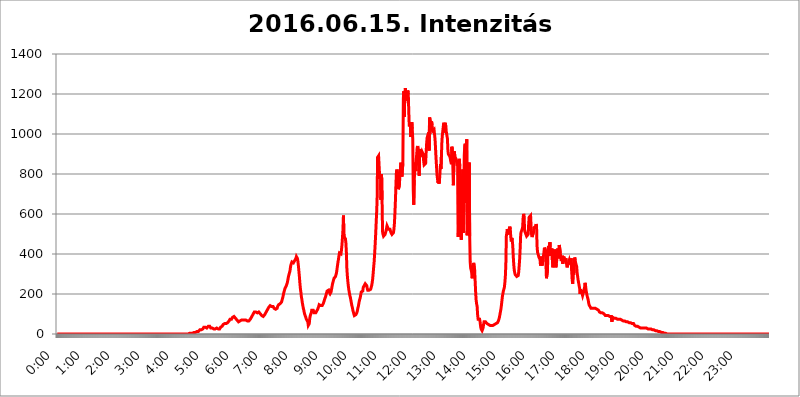
| Category | 2016.06.15. Intenzitás [W/m^2] |
|---|---|
| 0.0 | 0 |
| 0.0006944444444444445 | 0 |
| 0.001388888888888889 | 0 |
| 0.0020833333333333333 | 0 |
| 0.002777777777777778 | 0 |
| 0.003472222222222222 | 0 |
| 0.004166666666666667 | 0 |
| 0.004861111111111111 | 0 |
| 0.005555555555555556 | 0 |
| 0.0062499999999999995 | 0 |
| 0.006944444444444444 | 0 |
| 0.007638888888888889 | 0 |
| 0.008333333333333333 | 0 |
| 0.009027777777777779 | 0 |
| 0.009722222222222222 | 0 |
| 0.010416666666666666 | 0 |
| 0.011111111111111112 | 0 |
| 0.011805555555555555 | 0 |
| 0.012499999999999999 | 0 |
| 0.013194444444444444 | 0 |
| 0.013888888888888888 | 0 |
| 0.014583333333333332 | 0 |
| 0.015277777777777777 | 0 |
| 0.015972222222222224 | 0 |
| 0.016666666666666666 | 0 |
| 0.017361111111111112 | 0 |
| 0.018055555555555557 | 0 |
| 0.01875 | 0 |
| 0.019444444444444445 | 0 |
| 0.02013888888888889 | 0 |
| 0.020833333333333332 | 0 |
| 0.02152777777777778 | 0 |
| 0.022222222222222223 | 0 |
| 0.02291666666666667 | 0 |
| 0.02361111111111111 | 0 |
| 0.024305555555555556 | 0 |
| 0.024999999999999998 | 0 |
| 0.025694444444444447 | 0 |
| 0.02638888888888889 | 0 |
| 0.027083333333333334 | 0 |
| 0.027777777777777776 | 0 |
| 0.02847222222222222 | 0 |
| 0.029166666666666664 | 0 |
| 0.029861111111111113 | 0 |
| 0.030555555555555555 | 0 |
| 0.03125 | 0 |
| 0.03194444444444445 | 0 |
| 0.03263888888888889 | 0 |
| 0.03333333333333333 | 0 |
| 0.034027777777777775 | 0 |
| 0.034722222222222224 | 0 |
| 0.035416666666666666 | 0 |
| 0.036111111111111115 | 0 |
| 0.03680555555555556 | 0 |
| 0.0375 | 0 |
| 0.03819444444444444 | 0 |
| 0.03888888888888889 | 0 |
| 0.03958333333333333 | 0 |
| 0.04027777777777778 | 0 |
| 0.04097222222222222 | 0 |
| 0.041666666666666664 | 0 |
| 0.042361111111111106 | 0 |
| 0.04305555555555556 | 0 |
| 0.043750000000000004 | 0 |
| 0.044444444444444446 | 0 |
| 0.04513888888888889 | 0 |
| 0.04583333333333334 | 0 |
| 0.04652777777777778 | 0 |
| 0.04722222222222222 | 0 |
| 0.04791666666666666 | 0 |
| 0.04861111111111111 | 0 |
| 0.049305555555555554 | 0 |
| 0.049999999999999996 | 0 |
| 0.05069444444444445 | 0 |
| 0.051388888888888894 | 0 |
| 0.052083333333333336 | 0 |
| 0.05277777777777778 | 0 |
| 0.05347222222222222 | 0 |
| 0.05416666666666667 | 0 |
| 0.05486111111111111 | 0 |
| 0.05555555555555555 | 0 |
| 0.05625 | 0 |
| 0.05694444444444444 | 0 |
| 0.057638888888888885 | 0 |
| 0.05833333333333333 | 0 |
| 0.05902777777777778 | 0 |
| 0.059722222222222225 | 0 |
| 0.06041666666666667 | 0 |
| 0.061111111111111116 | 0 |
| 0.06180555555555556 | 0 |
| 0.0625 | 0 |
| 0.06319444444444444 | 0 |
| 0.06388888888888888 | 0 |
| 0.06458333333333334 | 0 |
| 0.06527777777777778 | 0 |
| 0.06597222222222222 | 0 |
| 0.06666666666666667 | 0 |
| 0.06736111111111111 | 0 |
| 0.06805555555555555 | 0 |
| 0.06874999999999999 | 0 |
| 0.06944444444444443 | 0 |
| 0.07013888888888889 | 0 |
| 0.07083333333333333 | 0 |
| 0.07152777777777779 | 0 |
| 0.07222222222222223 | 0 |
| 0.07291666666666667 | 0 |
| 0.07361111111111111 | 0 |
| 0.07430555555555556 | 0 |
| 0.075 | 0 |
| 0.07569444444444444 | 0 |
| 0.0763888888888889 | 0 |
| 0.07708333333333334 | 0 |
| 0.07777777777777778 | 0 |
| 0.07847222222222222 | 0 |
| 0.07916666666666666 | 0 |
| 0.0798611111111111 | 0 |
| 0.08055555555555556 | 0 |
| 0.08125 | 0 |
| 0.08194444444444444 | 0 |
| 0.08263888888888889 | 0 |
| 0.08333333333333333 | 0 |
| 0.08402777777777777 | 0 |
| 0.08472222222222221 | 0 |
| 0.08541666666666665 | 0 |
| 0.08611111111111112 | 0 |
| 0.08680555555555557 | 0 |
| 0.08750000000000001 | 0 |
| 0.08819444444444445 | 0 |
| 0.08888888888888889 | 0 |
| 0.08958333333333333 | 0 |
| 0.09027777777777778 | 0 |
| 0.09097222222222222 | 0 |
| 0.09166666666666667 | 0 |
| 0.09236111111111112 | 0 |
| 0.09305555555555556 | 0 |
| 0.09375 | 0 |
| 0.09444444444444444 | 0 |
| 0.09513888888888888 | 0 |
| 0.09583333333333333 | 0 |
| 0.09652777777777777 | 0 |
| 0.09722222222222222 | 0 |
| 0.09791666666666667 | 0 |
| 0.09861111111111111 | 0 |
| 0.09930555555555555 | 0 |
| 0.09999999999999999 | 0 |
| 0.10069444444444443 | 0 |
| 0.1013888888888889 | 0 |
| 0.10208333333333335 | 0 |
| 0.10277777777777779 | 0 |
| 0.10347222222222223 | 0 |
| 0.10416666666666667 | 0 |
| 0.10486111111111111 | 0 |
| 0.10555555555555556 | 0 |
| 0.10625 | 0 |
| 0.10694444444444444 | 0 |
| 0.1076388888888889 | 0 |
| 0.10833333333333334 | 0 |
| 0.10902777777777778 | 0 |
| 0.10972222222222222 | 0 |
| 0.1111111111111111 | 0 |
| 0.11180555555555556 | 0 |
| 0.11180555555555556 | 0 |
| 0.1125 | 0 |
| 0.11319444444444444 | 0 |
| 0.11388888888888889 | 0 |
| 0.11458333333333333 | 0 |
| 0.11527777777777777 | 0 |
| 0.11597222222222221 | 0 |
| 0.11666666666666665 | 0 |
| 0.1173611111111111 | 0 |
| 0.11805555555555557 | 0 |
| 0.11944444444444445 | 0 |
| 0.12013888888888889 | 0 |
| 0.12083333333333333 | 0 |
| 0.12152777777777778 | 0 |
| 0.12222222222222223 | 0 |
| 0.12291666666666667 | 0 |
| 0.12291666666666667 | 0 |
| 0.12361111111111112 | 0 |
| 0.12430555555555556 | 0 |
| 0.125 | 0 |
| 0.12569444444444444 | 0 |
| 0.12638888888888888 | 0 |
| 0.12708333333333333 | 0 |
| 0.16875 | 0 |
| 0.12847222222222224 | 0 |
| 0.12916666666666668 | 0 |
| 0.12986111111111112 | 0 |
| 0.13055555555555556 | 0 |
| 0.13125 | 0 |
| 0.13194444444444445 | 0 |
| 0.1326388888888889 | 0 |
| 0.13333333333333333 | 0 |
| 0.13402777777777777 | 0 |
| 0.13402777777777777 | 0 |
| 0.13472222222222222 | 0 |
| 0.13541666666666666 | 0 |
| 0.1361111111111111 | 0 |
| 0.13749999999999998 | 0 |
| 0.13819444444444443 | 0 |
| 0.1388888888888889 | 0 |
| 0.13958333333333334 | 0 |
| 0.14027777777777778 | 0 |
| 0.14097222222222222 | 0 |
| 0.14166666666666666 | 0 |
| 0.1423611111111111 | 0 |
| 0.14305555555555557 | 0 |
| 0.14375000000000002 | 0 |
| 0.14444444444444446 | 0 |
| 0.1451388888888889 | 0 |
| 0.1451388888888889 | 0 |
| 0.14652777777777778 | 0 |
| 0.14722222222222223 | 0 |
| 0.14791666666666667 | 0 |
| 0.1486111111111111 | 0 |
| 0.14930555555555555 | 0 |
| 0.15 | 0 |
| 0.15069444444444444 | 0 |
| 0.15138888888888888 | 0 |
| 0.15208333333333332 | 0 |
| 0.15277777777777776 | 0 |
| 0.15347222222222223 | 0 |
| 0.15416666666666667 | 0 |
| 0.15486111111111112 | 0 |
| 0.15555555555555556 | 0 |
| 0.15625 | 0 |
| 0.15694444444444444 | 0 |
| 0.15763888888888888 | 0 |
| 0.15833333333333333 | 0 |
| 0.15902777777777777 | 0 |
| 0.15972222222222224 | 0 |
| 0.16041666666666668 | 0 |
| 0.16111111111111112 | 0 |
| 0.16180555555555556 | 0 |
| 0.1625 | 0 |
| 0.16319444444444445 | 0 |
| 0.1638888888888889 | 0 |
| 0.16458333333333333 | 0 |
| 0.16527777777777777 | 0 |
| 0.16597222222222222 | 0 |
| 0.16666666666666666 | 0 |
| 0.1673611111111111 | 0 |
| 0.16805555555555554 | 0 |
| 0.16874999999999998 | 0 |
| 0.16944444444444443 | 0 |
| 0.17013888888888887 | 0 |
| 0.1708333333333333 | 0 |
| 0.17152777777777775 | 0 |
| 0.17222222222222225 | 0 |
| 0.1729166666666667 | 0 |
| 0.17361111111111113 | 0 |
| 0.17430555555555557 | 0 |
| 0.17500000000000002 | 0 |
| 0.17569444444444446 | 0 |
| 0.1763888888888889 | 0 |
| 0.17708333333333334 | 0 |
| 0.17777777777777778 | 0 |
| 0.17847222222222223 | 0 |
| 0.17916666666666667 | 0 |
| 0.1798611111111111 | 0 |
| 0.18055555555555555 | 0 |
| 0.18125 | 0 |
| 0.18194444444444444 | 0 |
| 0.1826388888888889 | 0 |
| 0.18333333333333335 | 0 |
| 0.1840277777777778 | 0 |
| 0.18472222222222223 | 3.525 |
| 0.18541666666666667 | 3.525 |
| 0.18611111111111112 | 3.525 |
| 0.18680555555555556 | 3.525 |
| 0.1875 | 3.525 |
| 0.18819444444444444 | 3.525 |
| 0.18888888888888888 | 3.525 |
| 0.18958333333333333 | 3.525 |
| 0.19027777777777777 | 3.525 |
| 0.1909722222222222 | 7.887 |
| 0.19166666666666665 | 7.887 |
| 0.19236111111111112 | 7.887 |
| 0.19305555555555554 | 7.887 |
| 0.19375 | 7.887 |
| 0.19444444444444445 | 7.887 |
| 0.1951388888888889 | 12.257 |
| 0.19583333333333333 | 12.257 |
| 0.19652777777777777 | 12.257 |
| 0.19722222222222222 | 12.257 |
| 0.19791666666666666 | 12.257 |
| 0.1986111111111111 | 16.636 |
| 0.19930555555555554 | 16.636 |
| 0.19999999999999998 | 21.024 |
| 0.20069444444444443 | 21.024 |
| 0.20138888888888887 | 21.024 |
| 0.2020833333333333 | 21.024 |
| 0.2027777777777778 | 21.024 |
| 0.2034722222222222 | 25.419 |
| 0.2041666666666667 | 25.419 |
| 0.20486111111111113 | 29.823 |
| 0.20555555555555557 | 34.234 |
| 0.20625000000000002 | 38.653 |
| 0.20694444444444446 | 34.234 |
| 0.2076388888888889 | 34.234 |
| 0.20833333333333334 | 29.823 |
| 0.20902777777777778 | 29.823 |
| 0.20972222222222223 | 29.823 |
| 0.21041666666666667 | 29.823 |
| 0.2111111111111111 | 29.823 |
| 0.21180555555555555 | 38.653 |
| 0.2125 | 38.653 |
| 0.21319444444444444 | 38.653 |
| 0.2138888888888889 | 38.653 |
| 0.21458333333333335 | 38.653 |
| 0.2152777777777778 | 29.823 |
| 0.21597222222222223 | 29.823 |
| 0.21666666666666667 | 29.823 |
| 0.21736111111111112 | 29.823 |
| 0.21805555555555556 | 25.419 |
| 0.21875 | 25.419 |
| 0.21944444444444444 | 25.419 |
| 0.22013888888888888 | 25.419 |
| 0.22083333333333333 | 25.419 |
| 0.22152777777777777 | 25.419 |
| 0.2222222222222222 | 25.419 |
| 0.22291666666666665 | 29.823 |
| 0.2236111111111111 | 29.823 |
| 0.22430555555555556 | 29.823 |
| 0.225 | 25.419 |
| 0.22569444444444445 | 25.419 |
| 0.2263888888888889 | 25.419 |
| 0.22708333333333333 | 25.419 |
| 0.22777777777777777 | 25.419 |
| 0.22847222222222222 | 29.823 |
| 0.22916666666666666 | 34.234 |
| 0.2298611111111111 | 34.234 |
| 0.23055555555555554 | 38.653 |
| 0.23124999999999998 | 38.653 |
| 0.23194444444444443 | 43.079 |
| 0.23263888888888887 | 47.511 |
| 0.2333333333333333 | 47.511 |
| 0.2340277777777778 | 51.951 |
| 0.2347222222222222 | 51.951 |
| 0.2354166666666667 | 51.951 |
| 0.23611111111111113 | 51.951 |
| 0.23680555555555557 | 51.951 |
| 0.23750000000000002 | 56.398 |
| 0.23819444444444446 | 56.398 |
| 0.2388888888888889 | 56.398 |
| 0.23958333333333334 | 60.85 |
| 0.24027777777777778 | 60.85 |
| 0.24097222222222223 | 65.31 |
| 0.24166666666666667 | 69.775 |
| 0.2423611111111111 | 74.246 |
| 0.24305555555555555 | 74.246 |
| 0.24375 | 74.246 |
| 0.24444444444444446 | 74.246 |
| 0.24513888888888888 | 78.722 |
| 0.24583333333333335 | 83.205 |
| 0.2465277777777778 | 87.692 |
| 0.24722222222222223 | 87.692 |
| 0.24791666666666667 | 87.692 |
| 0.24861111111111112 | 87.692 |
| 0.24930555555555556 | 83.205 |
| 0.25 | 78.722 |
| 0.25069444444444444 | 74.246 |
| 0.2513888888888889 | 74.246 |
| 0.2520833333333333 | 69.775 |
| 0.25277777777777777 | 65.31 |
| 0.2534722222222222 | 65.31 |
| 0.25416666666666665 | 60.85 |
| 0.2548611111111111 | 60.85 |
| 0.2555555555555556 | 65.31 |
| 0.25625000000000003 | 65.31 |
| 0.2569444444444445 | 65.31 |
| 0.2576388888888889 | 69.775 |
| 0.25833333333333336 | 69.775 |
| 0.2590277777777778 | 74.246 |
| 0.25972222222222224 | 69.775 |
| 0.2604166666666667 | 69.775 |
| 0.2611111111111111 | 69.775 |
| 0.26180555555555557 | 69.775 |
| 0.2625 | 69.775 |
| 0.26319444444444445 | 69.775 |
| 0.2638888888888889 | 69.775 |
| 0.26458333333333334 | 69.775 |
| 0.2652777777777778 | 69.775 |
| 0.2659722222222222 | 65.31 |
| 0.26666666666666666 | 65.31 |
| 0.2673611111111111 | 60.85 |
| 0.26805555555555555 | 60.85 |
| 0.26875 | 65.31 |
| 0.26944444444444443 | 65.31 |
| 0.2701388888888889 | 69.775 |
| 0.2708333333333333 | 74.246 |
| 0.27152777777777776 | 78.722 |
| 0.2722222222222222 | 83.205 |
| 0.27291666666666664 | 83.205 |
| 0.2736111111111111 | 92.184 |
| 0.2743055555555555 | 96.682 |
| 0.27499999999999997 | 101.184 |
| 0.27569444444444446 | 105.69 |
| 0.27638888888888885 | 110.201 |
| 0.27708333333333335 | 114.716 |
| 0.2777777777777778 | 114.716 |
| 0.27847222222222223 | 110.201 |
| 0.2791666666666667 | 110.201 |
| 0.2798611111111111 | 105.69 |
| 0.28055555555555556 | 105.69 |
| 0.28125 | 105.69 |
| 0.28194444444444444 | 105.69 |
| 0.2826388888888889 | 110.201 |
| 0.2833333333333333 | 110.201 |
| 0.28402777777777777 | 105.69 |
| 0.2847222222222222 | 101.184 |
| 0.28541666666666665 | 101.184 |
| 0.28611111111111115 | 96.682 |
| 0.28680555555555554 | 92.184 |
| 0.28750000000000003 | 87.692 |
| 0.2881944444444445 | 87.692 |
| 0.2888888888888889 | 87.692 |
| 0.28958333333333336 | 92.184 |
| 0.2902777777777778 | 92.184 |
| 0.29097222222222224 | 96.682 |
| 0.2916666666666667 | 101.184 |
| 0.2923611111111111 | 105.69 |
| 0.29305555555555557 | 110.201 |
| 0.29375 | 114.716 |
| 0.29444444444444445 | 119.235 |
| 0.2951388888888889 | 123.758 |
| 0.29583333333333334 | 128.284 |
| 0.2965277777777778 | 132.814 |
| 0.2972222222222222 | 137.347 |
| 0.29791666666666666 | 137.347 |
| 0.2986111111111111 | 141.884 |
| 0.29930555555555555 | 137.347 |
| 0.3 | 137.347 |
| 0.30069444444444443 | 137.347 |
| 0.3013888888888889 | 137.347 |
| 0.3020833333333333 | 137.347 |
| 0.30277777777777776 | 137.347 |
| 0.3034722222222222 | 132.814 |
| 0.30416666666666664 | 128.284 |
| 0.3048611111111111 | 123.758 |
| 0.3055555555555555 | 123.758 |
| 0.30624999999999997 | 123.758 |
| 0.3069444444444444 | 123.758 |
| 0.3076388888888889 | 123.758 |
| 0.30833333333333335 | 128.284 |
| 0.3090277777777778 | 137.347 |
| 0.30972222222222223 | 141.884 |
| 0.3104166666666667 | 146.423 |
| 0.3111111111111111 | 150.964 |
| 0.31180555555555556 | 150.964 |
| 0.3125 | 150.964 |
| 0.31319444444444444 | 150.964 |
| 0.3138888888888889 | 155.509 |
| 0.3145833333333333 | 160.056 |
| 0.31527777777777777 | 164.605 |
| 0.3159722222222222 | 178.264 |
| 0.31666666666666665 | 187.378 |
| 0.31736111111111115 | 201.058 |
| 0.31805555555555554 | 210.182 |
| 0.31875000000000003 | 219.309 |
| 0.3194444444444445 | 228.436 |
| 0.3201388888888889 | 233 |
| 0.32083333333333336 | 237.564 |
| 0.3215277777777778 | 242.127 |
| 0.32222222222222224 | 251.251 |
| 0.3229166666666667 | 260.373 |
| 0.3236111111111111 | 274.047 |
| 0.32430555555555557 | 287.709 |
| 0.325 | 296.808 |
| 0.32569444444444445 | 301.354 |
| 0.3263888888888889 | 314.98 |
| 0.32708333333333334 | 333.113 |
| 0.3277777777777778 | 346.682 |
| 0.3284722222222222 | 351.198 |
| 0.32916666666666666 | 360.221 |
| 0.3298611111111111 | 355.712 |
| 0.33055555555555555 | 360.221 |
| 0.33125 | 355.712 |
| 0.33194444444444443 | 355.712 |
| 0.3326388888888889 | 360.221 |
| 0.3333333333333333 | 369.23 |
| 0.3340277777777778 | 373.729 |
| 0.3347222222222222 | 378.224 |
| 0.3354166666666667 | 387.202 |
| 0.3361111111111111 | 387.202 |
| 0.3368055555555556 | 378.224 |
| 0.33749999999999997 | 364.728 |
| 0.33819444444444446 | 342.162 |
| 0.33888888888888885 | 314.98 |
| 0.33958333333333335 | 287.709 |
| 0.34027777777777773 | 255.813 |
| 0.34097222222222223 | 228.436 |
| 0.3416666666666666 | 210.182 |
| 0.3423611111111111 | 187.378 |
| 0.3430555555555555 | 173.709 |
| 0.34375 | 155.509 |
| 0.3444444444444445 | 141.884 |
| 0.3451388888888889 | 128.284 |
| 0.3458333333333334 | 119.235 |
| 0.34652777777777777 | 105.69 |
| 0.34722222222222227 | 96.682 |
| 0.34791666666666665 | 92.184 |
| 0.34861111111111115 | 83.205 |
| 0.34930555555555554 | 74.246 |
| 0.35000000000000003 | 69.775 |
| 0.3506944444444444 | 69.775 |
| 0.3513888888888889 | 60.85 |
| 0.3520833333333333 | 43.079 |
| 0.3527777777777778 | 38.653 |
| 0.3534722222222222 | 51.951 |
| 0.3541666666666667 | 78.722 |
| 0.3548611111111111 | 92.184 |
| 0.35555555555555557 | 96.682 |
| 0.35625 | 105.69 |
| 0.35694444444444445 | 119.235 |
| 0.3576388888888889 | 123.758 |
| 0.35833333333333334 | 119.235 |
| 0.3590277777777778 | 119.235 |
| 0.3597222222222222 | 114.716 |
| 0.36041666666666666 | 105.69 |
| 0.3611111111111111 | 101.184 |
| 0.36180555555555555 | 101.184 |
| 0.3625 | 105.69 |
| 0.36319444444444443 | 110.201 |
| 0.3638888888888889 | 114.716 |
| 0.3645833333333333 | 119.235 |
| 0.3652777777777778 | 123.758 |
| 0.3659722222222222 | 128.284 |
| 0.3666666666666667 | 137.347 |
| 0.3673611111111111 | 146.423 |
| 0.3680555555555556 | 146.423 |
| 0.36874999999999997 | 146.423 |
| 0.36944444444444446 | 141.884 |
| 0.37013888888888885 | 141.884 |
| 0.37083333333333335 | 141.884 |
| 0.37152777777777773 | 141.884 |
| 0.37222222222222223 | 146.423 |
| 0.3729166666666666 | 150.964 |
| 0.3736111111111111 | 155.509 |
| 0.3743055555555555 | 164.605 |
| 0.375 | 173.709 |
| 0.3756944444444445 | 178.264 |
| 0.3763888888888889 | 187.378 |
| 0.3770833333333334 | 196.497 |
| 0.37777777777777777 | 205.62 |
| 0.37847222222222227 | 214.746 |
| 0.37916666666666665 | 219.309 |
| 0.37986111111111115 | 219.309 |
| 0.38055555555555554 | 219.309 |
| 0.38125000000000003 | 210.182 |
| 0.3819444444444444 | 205.62 |
| 0.3826388888888889 | 201.058 |
| 0.3833333333333333 | 205.62 |
| 0.3840277777777778 | 210.182 |
| 0.3847222222222222 | 223.873 |
| 0.3854166666666667 | 237.564 |
| 0.3861111111111111 | 251.251 |
| 0.38680555555555557 | 260.373 |
| 0.3875 | 269.49 |
| 0.38819444444444445 | 278.603 |
| 0.3888888888888889 | 283.156 |
| 0.38958333333333334 | 283.156 |
| 0.3902777777777778 | 287.709 |
| 0.3909722222222222 | 292.259 |
| 0.39166666666666666 | 305.898 |
| 0.3923611111111111 | 324.052 |
| 0.39305555555555555 | 342.162 |
| 0.39375 | 360.221 |
| 0.39444444444444443 | 373.729 |
| 0.3951388888888889 | 391.685 |
| 0.3958333333333333 | 405.108 |
| 0.3965277777777778 | 405.108 |
| 0.3972222222222222 | 405.108 |
| 0.3979166666666667 | 400.638 |
| 0.3986111111111111 | 418.492 |
| 0.3993055555555556 | 445.129 |
| 0.39999999999999997 | 480.356 |
| 0.40069444444444446 | 519.555 |
| 0.40138888888888885 | 592.233 |
| 0.40208333333333335 | 489.108 |
| 0.40277777777777773 | 493.475 |
| 0.40347222222222223 | 484.735 |
| 0.4041666666666666 | 475.972 |
| 0.4048611111111111 | 453.968 |
| 0.4055555555555555 | 405.108 |
| 0.40625 | 324.052 |
| 0.4069444444444445 | 287.709 |
| 0.4076388888888889 | 260.373 |
| 0.4083333333333334 | 237.564 |
| 0.40902777777777777 | 219.309 |
| 0.40972222222222227 | 205.62 |
| 0.41041666666666665 | 191.937 |
| 0.41111111111111115 | 182.82 |
| 0.41180555555555554 | 169.156 |
| 0.41250000000000003 | 155.509 |
| 0.4131944444444444 | 141.884 |
| 0.4138888888888889 | 132.814 |
| 0.4145833333333333 | 119.235 |
| 0.4152777777777778 | 114.716 |
| 0.4159722222222222 | 101.184 |
| 0.4166666666666667 | 92.184 |
| 0.4173611111111111 | 92.184 |
| 0.41805555555555557 | 92.184 |
| 0.41875 | 96.682 |
| 0.41944444444444445 | 96.682 |
| 0.4201388888888889 | 105.69 |
| 0.42083333333333334 | 114.716 |
| 0.4215277777777778 | 128.284 |
| 0.4222222222222222 | 137.347 |
| 0.42291666666666666 | 150.964 |
| 0.4236111111111111 | 164.605 |
| 0.42430555555555555 | 173.709 |
| 0.425 | 182.82 |
| 0.42569444444444443 | 196.497 |
| 0.4263888888888889 | 210.182 |
| 0.4270833333333333 | 214.746 |
| 0.4277777777777778 | 214.746 |
| 0.4284722222222222 | 214.746 |
| 0.4291666666666667 | 233 |
| 0.4298611111111111 | 237.564 |
| 0.4305555555555556 | 242.127 |
| 0.43124999999999997 | 246.689 |
| 0.43194444444444446 | 251.251 |
| 0.43263888888888885 | 251.251 |
| 0.43333333333333335 | 246.689 |
| 0.43402777777777773 | 242.127 |
| 0.43472222222222223 | 228.436 |
| 0.4354166666666666 | 219.309 |
| 0.4361111111111111 | 219.309 |
| 0.4368055555555555 | 219.309 |
| 0.4375 | 219.309 |
| 0.4381944444444445 | 219.309 |
| 0.4388888888888889 | 219.309 |
| 0.4395833333333334 | 223.873 |
| 0.44027777777777777 | 233 |
| 0.44097222222222227 | 242.127 |
| 0.44166666666666665 | 255.813 |
| 0.44236111111111115 | 274.047 |
| 0.44305555555555554 | 301.354 |
| 0.44375000000000003 | 333.113 |
| 0.4444444444444444 | 360.221 |
| 0.4451388888888889 | 400.638 |
| 0.4458333333333333 | 445.129 |
| 0.4465277777777778 | 493.475 |
| 0.4472222222222222 | 549.704 |
| 0.4479166666666667 | 604.864 |
| 0.4486111111111111 | 671.22 |
| 0.44930555555555557 | 883.516 |
| 0.45 | 887.309 |
| 0.45069444444444445 | 891.099 |
| 0.4513888888888889 | 891.099 |
| 0.45208333333333334 | 795.074 |
| 0.4527777777777778 | 775.492 |
| 0.4534722222222222 | 798.974 |
| 0.45416666666666666 | 671.22 |
| 0.4548611111111111 | 798.974 |
| 0.45555555555555555 | 671.22 |
| 0.45625 | 510.885 |
| 0.45694444444444443 | 497.836 |
| 0.4576388888888889 | 489.108 |
| 0.4583333333333333 | 489.108 |
| 0.4590277777777778 | 489.108 |
| 0.4597222222222222 | 497.836 |
| 0.4604166666666667 | 506.542 |
| 0.4611111111111111 | 515.223 |
| 0.4618055555555556 | 528.2 |
| 0.46249999999999997 | 541.121 |
| 0.46319444444444446 | 541.121 |
| 0.46388888888888885 | 536.82 |
| 0.46458333333333335 | 523.88 |
| 0.46527777777777773 | 519.555 |
| 0.46597222222222223 | 523.88 |
| 0.4666666666666666 | 523.88 |
| 0.4673611111111111 | 515.223 |
| 0.4680555555555555 | 506.542 |
| 0.46875 | 502.192 |
| 0.4694444444444445 | 497.836 |
| 0.4701388888888889 | 493.475 |
| 0.4708333333333334 | 497.836 |
| 0.47152777777777777 | 506.542 |
| 0.47222222222222227 | 523.88 |
| 0.47291666666666665 | 553.986 |
| 0.47361111111111115 | 604.864 |
| 0.47430555555555554 | 667.123 |
| 0.47500000000000003 | 743.859 |
| 0.4756944444444444 | 810.641 |
| 0.4763888888888889 | 822.26 |
| 0.4770833333333333 | 810.641 |
| 0.4777777777777778 | 771.559 |
| 0.4784722222222222 | 723.889 |
| 0.4791666666666667 | 719.877 |
| 0.4798611111111111 | 743.859 |
| 0.48055555555555557 | 791.169 |
| 0.48125 | 795.074 |
| 0.48194444444444445 | 856.855 |
| 0.4826388888888889 | 860.676 |
| 0.48333333333333334 | 787.258 |
| 0.4840277777777778 | 791.169 |
| 0.4847222222222222 | 853.029 |
| 0.48541666666666666 | 1178.177 |
| 0.4861111111111111 | 1213.804 |
| 0.48680555555555555 | 1086.097 |
| 0.4875 | 1201.843 |
| 0.48819444444444443 | 1229.899 |
| 0.4888888888888889 | 1225.859 |
| 0.4895833333333333 | 1178.177 |
| 0.4902777777777778 | 1166.46 |
| 0.4909722222222222 | 1189.969 |
| 0.4916666666666667 | 1217.812 |
| 0.4923611111111111 | 1197.876 |
| 0.4930555555555556 | 1108.816 |
| 0.49374999999999997 | 1037.277 |
| 0.49444444444444446 | 1044.762 |
| 0.49513888888888885 | 1059.756 |
| 0.49583333333333335 | 984.98 |
| 0.49652777777777773 | 999.916 |
| 0.49722222222222223 | 1059.756 |
| 0.4979166666666666 | 1026.06 |
| 0.4986111111111111 | 977.508 |
| 0.4993055555555555 | 719.877 |
| 0.5 | 646.537 |
| 0.5006944444444444 | 771.559 |
| 0.5013888888888889 | 810.641 |
| 0.5020833333333333 | 856.855 |
| 0.5027777777777778 | 814.519 |
| 0.5034722222222222 | 872.114 |
| 0.5041666666666667 | 898.668 |
| 0.5048611111111111 | 932.576 |
| 0.5055555555555555 | 940.082 |
| 0.50625 | 917.534 |
| 0.5069444444444444 | 829.981 |
| 0.5076388888888889 | 791.169 |
| 0.5083333333333333 | 894.885 |
| 0.5090277777777777 | 925.06 |
| 0.5097222222222222 | 913.766 |
| 0.5104166666666666 | 887.309 |
| 0.5111111111111112 | 891.099 |
| 0.5118055555555555 | 909.996 |
| 0.5125000000000001 | 909.996 |
| 0.5131944444444444 | 898.668 |
| 0.513888888888889 | 864.493 |
| 0.5145833333333333 | 845.365 |
| 0.5152777777777778 | 849.199 |
| 0.5159722222222222 | 849.199 |
| 0.5166666666666667 | 853.029 |
| 0.517361111111111 | 906.223 |
| 0.5180555555555556 | 951.327 |
| 0.5187499999999999 | 981.244 |
| 0.5194444444444445 | 981.244 |
| 0.5201388888888888 | 981.244 |
| 0.5208333333333334 | 1007.383 |
| 0.5215277777777778 | 917.534 |
| 0.5222222222222223 | 1082.324 |
| 0.5229166666666667 | 1071.027 |
| 0.5236111111111111 | 1074.789 |
| 0.5243055555555556 | 1056.004 |
| 0.525 | 1063.51 |
| 0.5256944444444445 | 1044.762 |
| 0.5263888888888889 | 1014.852 |
| 0.5270833333333333 | 1014.852 |
| 0.5277777777777778 | 1014.852 |
| 0.5284722222222222 | 1022.323 |
| 0.5291666666666667 | 1022.323 |
| 0.5298611111111111 | 973.772 |
| 0.5305555555555556 | 928.819 |
| 0.53125 | 879.719 |
| 0.5319444444444444 | 837.682 |
| 0.5326388888888889 | 795.074 |
| 0.5333333333333333 | 775.492 |
| 0.5340277777777778 | 755.766 |
| 0.5347222222222222 | 767.62 |
| 0.5354166666666667 | 751.803 |
| 0.5361111111111111 | 767.62 |
| 0.5368055555555555 | 806.757 |
| 0.5375 | 849.199 |
| 0.5381944444444444 | 826.123 |
| 0.5388888888888889 | 898.668 |
| 0.5395833333333333 | 970.034 |
| 0.5402777777777777 | 999.916 |
| 0.5409722222222222 | 1003.65 |
| 0.5416666666666666 | 1044.762 |
| 0.5423611111111112 | 1056.004 |
| 0.5430555555555555 | 1007.383 |
| 0.5437500000000001 | 1037.277 |
| 0.5444444444444444 | 1056.004 |
| 0.545138888888889 | 1022.323 |
| 0.5458333333333333 | 1022.323 |
| 0.5465277777777778 | 1018.587 |
| 0.5472222222222222 | 977.508 |
| 0.5479166666666667 | 917.534 |
| 0.548611111111111 | 898.668 |
| 0.5493055555555556 | 898.668 |
| 0.5499999999999999 | 902.447 |
| 0.5506944444444445 | 887.309 |
| 0.5513888888888888 | 883.516 |
| 0.5520833333333334 | 860.676 |
| 0.5527777777777778 | 849.199 |
| 0.5534722222222223 | 936.33 |
| 0.5541666666666667 | 921.298 |
| 0.5548611111111111 | 917.534 |
| 0.5555555555555556 | 743.859 |
| 0.55625 | 860.676 |
| 0.5569444444444445 | 913.766 |
| 0.5576388888888889 | 887.309 |
| 0.5583333333333333 | 883.516 |
| 0.5590277777777778 | 891.099 |
| 0.5597222222222222 | 872.114 |
| 0.5604166666666667 | 849.199 |
| 0.5611111111111111 | 841.526 |
| 0.5618055555555556 | 868.305 |
| 0.5625 | 484.735 |
| 0.5631944444444444 | 625.784 |
| 0.5638888888888889 | 875.918 |
| 0.5645833333333333 | 837.682 |
| 0.5652777777777778 | 625.784 |
| 0.5659722222222222 | 600.661 |
| 0.5666666666666667 | 471.582 |
| 0.5673611111111111 | 654.791 |
| 0.5680555555555555 | 763.674 |
| 0.56875 | 822.26 |
| 0.5694444444444444 | 506.542 |
| 0.5701388888888889 | 646.537 |
| 0.5708333333333333 | 891.099 |
| 0.5715277777777777 | 940.082 |
| 0.5722222222222222 | 951.327 |
| 0.5729166666666666 | 654.791 |
| 0.5736111111111112 | 868.305 |
| 0.5743055555555555 | 973.772 |
| 0.5750000000000001 | 493.475 |
| 0.5756944444444444 | 562.53 |
| 0.576388888888889 | 663.019 |
| 0.5770833333333333 | 541.121 |
| 0.5777777777777778 | 856.855 |
| 0.5784722222222222 | 489.108 |
| 0.5791666666666667 | 360.221 |
| 0.579861111111111 | 328.584 |
| 0.5805555555555556 | 319.517 |
| 0.5812499999999999 | 305.898 |
| 0.5819444444444445 | 278.603 |
| 0.5826388888888888 | 278.603 |
| 0.5833333333333334 | 319.517 |
| 0.5840277777777778 | 355.712 |
| 0.5847222222222223 | 355.712 |
| 0.5854166666666667 | 319.517 |
| 0.5861111111111111 | 264.932 |
| 0.5868055555555556 | 210.182 |
| 0.5875 | 169.156 |
| 0.5881944444444445 | 150.964 |
| 0.5888888888888889 | 137.347 |
| 0.5895833333333333 | 96.682 |
| 0.5902777777777778 | 74.246 |
| 0.5909722222222222 | 69.775 |
| 0.5916666666666667 | 74.246 |
| 0.5923611111111111 | 74.246 |
| 0.5930555555555556 | 60.85 |
| 0.59375 | 38.653 |
| 0.5944444444444444 | 25.419 |
| 0.5951388888888889 | 21.024 |
| 0.5958333333333333 | 16.636 |
| 0.5965277777777778 | 16.636 |
| 0.5972222222222222 | 29.823 |
| 0.5979166666666667 | 47.511 |
| 0.5986111111111111 | 60.85 |
| 0.5993055555555555 | 65.31 |
| 0.6 | 65.31 |
| 0.6006944444444444 | 60.85 |
| 0.6013888888888889 | 60.85 |
| 0.6020833333333333 | 56.398 |
| 0.6027777777777777 | 51.951 |
| 0.6034722222222222 | 51.951 |
| 0.6041666666666666 | 51.951 |
| 0.6048611111111112 | 47.511 |
| 0.6055555555555555 | 47.511 |
| 0.6062500000000001 | 43.079 |
| 0.6069444444444444 | 43.079 |
| 0.607638888888889 | 43.079 |
| 0.6083333333333333 | 43.079 |
| 0.6090277777777778 | 43.079 |
| 0.6097222222222222 | 43.079 |
| 0.6104166666666667 | 43.079 |
| 0.611111111111111 | 43.079 |
| 0.6118055555555556 | 47.511 |
| 0.6124999999999999 | 47.511 |
| 0.6131944444444445 | 47.511 |
| 0.6138888888888888 | 47.511 |
| 0.6145833333333334 | 51.951 |
| 0.6152777777777778 | 51.951 |
| 0.6159722222222223 | 51.951 |
| 0.6166666666666667 | 51.951 |
| 0.6173611111111111 | 56.398 |
| 0.6180555555555556 | 60.85 |
| 0.61875 | 65.31 |
| 0.6194444444444445 | 74.246 |
| 0.6201388888888889 | 83.205 |
| 0.6208333333333333 | 96.682 |
| 0.6215277777777778 | 110.201 |
| 0.6222222222222222 | 123.758 |
| 0.6229166666666667 | 141.884 |
| 0.6236111111111111 | 164.605 |
| 0.6243055555555556 | 187.378 |
| 0.625 | 201.058 |
| 0.6256944444444444 | 214.746 |
| 0.6263888888888889 | 223.873 |
| 0.6270833333333333 | 233 |
| 0.6277777777777778 | 255.813 |
| 0.6284722222222222 | 287.709 |
| 0.6291666666666667 | 346.682 |
| 0.6298611111111111 | 489.108 |
| 0.6305555555555555 | 506.542 |
| 0.63125 | 523.88 |
| 0.6319444444444444 | 497.836 |
| 0.6326388888888889 | 502.192 |
| 0.6333333333333333 | 515.223 |
| 0.6340277777777777 | 528.2 |
| 0.6347222222222222 | 536.82 |
| 0.6354166666666666 | 523.88 |
| 0.6361111111111112 | 484.735 |
| 0.6368055555555555 | 462.786 |
| 0.6375000000000001 | 480.356 |
| 0.6381944444444444 | 467.187 |
| 0.638888888888889 | 440.702 |
| 0.6395833333333333 | 387.202 |
| 0.6402777777777778 | 346.682 |
| 0.6409722222222222 | 319.517 |
| 0.6416666666666667 | 305.898 |
| 0.642361111111111 | 296.808 |
| 0.6430555555555556 | 292.259 |
| 0.6437499999999999 | 296.808 |
| 0.6444444444444445 | 287.709 |
| 0.6451388888888888 | 287.709 |
| 0.6458333333333334 | 287.709 |
| 0.6465277777777778 | 292.259 |
| 0.6472222222222223 | 310.44 |
| 0.6479166666666667 | 342.162 |
| 0.6486111111111111 | 378.224 |
| 0.6493055555555556 | 431.833 |
| 0.65 | 497.836 |
| 0.6506944444444445 | 510.885 |
| 0.6513888888888889 | 515.223 |
| 0.6520833333333333 | 523.88 |
| 0.6527777777777778 | 536.82 |
| 0.6534722222222222 | 583.779 |
| 0.6541666666666667 | 600.661 |
| 0.6548611111111111 | 575.299 |
| 0.6555555555555556 | 515.223 |
| 0.65625 | 510.885 |
| 0.6569444444444444 | 502.192 |
| 0.6576388888888889 | 497.836 |
| 0.6583333333333333 | 489.108 |
| 0.6590277777777778 | 489.108 |
| 0.6597222222222222 | 489.108 |
| 0.6604166666666667 | 497.836 |
| 0.6611111111111111 | 545.416 |
| 0.6618055555555555 | 583.779 |
| 0.6625 | 588.009 |
| 0.6631944444444444 | 588.009 |
| 0.6638888888888889 | 592.233 |
| 0.6645833333333333 | 536.82 |
| 0.6652777777777777 | 497.836 |
| 0.6659722222222222 | 484.735 |
| 0.6666666666666666 | 480.356 |
| 0.6673611111111111 | 480.356 |
| 0.6680555555555556 | 510.885 |
| 0.6687500000000001 | 532.513 |
| 0.6694444444444444 | 532.513 |
| 0.6701388888888888 | 528.2 |
| 0.6708333333333334 | 536.82 |
| 0.6715277777777778 | 549.704 |
| 0.6722222222222222 | 541.121 |
| 0.6729166666666666 | 440.702 |
| 0.6736111111111112 | 409.574 |
| 0.6743055555555556 | 400.638 |
| 0.6749999999999999 | 400.638 |
| 0.6756944444444444 | 382.715 |
| 0.6763888888888889 | 382.715 |
| 0.6770833333333334 | 373.729 |
| 0.6777777777777777 | 342.162 |
| 0.6784722222222223 | 364.728 |
| 0.6791666666666667 | 387.202 |
| 0.6798611111111111 | 342.162 |
| 0.6805555555555555 | 342.162 |
| 0.68125 | 369.23 |
| 0.6819444444444445 | 391.685 |
| 0.6826388888888889 | 409.574 |
| 0.6833333333333332 | 431.833 |
| 0.6840277777777778 | 431.833 |
| 0.6847222222222222 | 418.492 |
| 0.6854166666666667 | 351.198 |
| 0.686111111111111 | 278.603 |
| 0.6868055555555556 | 278.603 |
| 0.6875 | 314.98 |
| 0.6881944444444444 | 396.164 |
| 0.688888888888889 | 440.702 |
| 0.6895833333333333 | 445.129 |
| 0.6902777777777778 | 418.492 |
| 0.6909722222222222 | 458.38 |
| 0.6916666666666668 | 391.685 |
| 0.6923611111111111 | 396.164 |
| 0.6930555555555555 | 387.202 |
| 0.69375 | 427.39 |
| 0.6944444444444445 | 369.23 |
| 0.6951388888888889 | 333.113 |
| 0.6958333333333333 | 369.23 |
| 0.6965277777777777 | 382.715 |
| 0.6972222222222223 | 422.943 |
| 0.6979166666666666 | 391.685 |
| 0.6986111111111111 | 387.202 |
| 0.6993055555555556 | 333.113 |
| 0.7000000000000001 | 351.198 |
| 0.7006944444444444 | 373.729 |
| 0.7013888888888888 | 414.035 |
| 0.7020833333333334 | 427.39 |
| 0.7027777777777778 | 422.943 |
| 0.7034722222222222 | 378.224 |
| 0.7041666666666666 | 445.129 |
| 0.7048611111111112 | 440.702 |
| 0.7055555555555556 | 405.108 |
| 0.7062499999999999 | 378.224 |
| 0.7069444444444444 | 364.728 |
| 0.7076388888888889 | 369.23 |
| 0.7083333333333334 | 391.685 |
| 0.7090277777777777 | 351.198 |
| 0.7097222222222223 | 351.198 |
| 0.7104166666666667 | 387.202 |
| 0.7111111111111111 | 373.729 |
| 0.7118055555555555 | 378.224 |
| 0.7125 | 360.221 |
| 0.7131944444444445 | 378.224 |
| 0.7138888888888889 | 364.728 |
| 0.7145833333333332 | 342.162 |
| 0.7152777777777778 | 333.113 |
| 0.7159722222222222 | 346.682 |
| 0.7166666666666667 | 342.162 |
| 0.717361111111111 | 351.198 |
| 0.7180555555555556 | 369.23 |
| 0.71875 | 369.23 |
| 0.7194444444444444 | 346.682 |
| 0.720138888888889 | 355.712 |
| 0.7208333333333333 | 378.224 |
| 0.7215277777777778 | 314.98 |
| 0.7222222222222222 | 269.49 |
| 0.7229166666666668 | 251.251 |
| 0.7236111111111111 | 305.898 |
| 0.7243055555555555 | 296.808 |
| 0.725 | 319.517 |
| 0.7256944444444445 | 382.715 |
| 0.7263888888888889 | 369.23 |
| 0.7270833333333333 | 355.712 |
| 0.7277777777777777 | 351.198 |
| 0.7284722222222223 | 337.639 |
| 0.7291666666666666 | 305.898 |
| 0.7298611111111111 | 287.709 |
| 0.7305555555555556 | 269.49 |
| 0.7312500000000001 | 255.813 |
| 0.7319444444444444 | 242.127 |
| 0.7326388888888888 | 228.436 |
| 0.7333333333333334 | 201.058 |
| 0.7340277777777778 | 223.873 |
| 0.7347222222222222 | 201.058 |
| 0.7354166666666666 | 219.309 |
| 0.7361111111111112 | 201.058 |
| 0.7368055555555556 | 191.937 |
| 0.7374999999999999 | 201.058 |
| 0.7381944444444444 | 210.182 |
| 0.7388888888888889 | 210.182 |
| 0.7395833333333334 | 233 |
| 0.7402777777777777 | 255.813 |
| 0.7409722222222223 | 242.127 |
| 0.7416666666666667 | 219.309 |
| 0.7423611111111111 | 214.746 |
| 0.7430555555555555 | 191.937 |
| 0.74375 | 187.378 |
| 0.7444444444444445 | 173.709 |
| 0.7451388888888889 | 160.056 |
| 0.7458333333333332 | 146.423 |
| 0.7465277777777778 | 141.884 |
| 0.7472222222222222 | 137.347 |
| 0.7479166666666667 | 132.814 |
| 0.748611111111111 | 128.284 |
| 0.7493055555555556 | 128.284 |
| 0.75 | 128.284 |
| 0.7506944444444444 | 128.284 |
| 0.751388888888889 | 128.284 |
| 0.7520833333333333 | 128.284 |
| 0.7527777777777778 | 128.284 |
| 0.7534722222222222 | 128.284 |
| 0.7541666666666668 | 128.284 |
| 0.7548611111111111 | 128.284 |
| 0.7555555555555555 | 128.284 |
| 0.75625 | 128.284 |
| 0.7569444444444445 | 123.758 |
| 0.7576388888888889 | 123.758 |
| 0.7583333333333333 | 119.235 |
| 0.7590277777777777 | 119.235 |
| 0.7597222222222223 | 114.716 |
| 0.7604166666666666 | 110.201 |
| 0.7611111111111111 | 110.201 |
| 0.7618055555555556 | 110.201 |
| 0.7625000000000001 | 105.69 |
| 0.7631944444444444 | 105.69 |
| 0.7638888888888888 | 105.69 |
| 0.7645833333333334 | 105.69 |
| 0.7652777777777778 | 101.184 |
| 0.7659722222222222 | 101.184 |
| 0.7666666666666666 | 101.184 |
| 0.7673611111111112 | 96.682 |
| 0.7680555555555556 | 96.682 |
| 0.7687499999999999 | 92.184 |
| 0.7694444444444444 | 92.184 |
| 0.7701388888888889 | 92.184 |
| 0.7708333333333334 | 92.184 |
| 0.7715277777777777 | 92.184 |
| 0.7722222222222223 | 92.184 |
| 0.7729166666666667 | 92.184 |
| 0.7736111111111111 | 87.692 |
| 0.7743055555555555 | 87.692 |
| 0.775 | 87.692 |
| 0.7756944444444445 | 87.692 |
| 0.7763888888888889 | 87.692 |
| 0.7770833333333332 | 87.692 |
| 0.7777777777777778 | 60.85 |
| 0.7784722222222222 | 65.31 |
| 0.7791666666666667 | 83.205 |
| 0.779861111111111 | 83.205 |
| 0.7805555555555556 | 83.205 |
| 0.78125 | 78.722 |
| 0.7819444444444444 | 78.722 |
| 0.782638888888889 | 78.722 |
| 0.7833333333333333 | 78.722 |
| 0.7840277777777778 | 74.246 |
| 0.7847222222222222 | 74.246 |
| 0.7854166666666668 | 74.246 |
| 0.7861111111111111 | 74.246 |
| 0.7868055555555555 | 74.246 |
| 0.7875 | 74.246 |
| 0.7881944444444445 | 74.246 |
| 0.7888888888888889 | 74.246 |
| 0.7895833333333333 | 74.246 |
| 0.7902777777777777 | 69.775 |
| 0.7909722222222223 | 69.775 |
| 0.7916666666666666 | 69.775 |
| 0.7923611111111111 | 69.775 |
| 0.7930555555555556 | 65.31 |
| 0.7937500000000001 | 65.31 |
| 0.7944444444444444 | 65.31 |
| 0.7951388888888888 | 65.31 |
| 0.7958333333333334 | 65.31 |
| 0.7965277777777778 | 65.31 |
| 0.7972222222222222 | 60.85 |
| 0.7979166666666666 | 60.85 |
| 0.7986111111111112 | 60.85 |
| 0.7993055555555556 | 60.85 |
| 0.7999999999999999 | 60.85 |
| 0.8006944444444444 | 56.398 |
| 0.8013888888888889 | 56.398 |
| 0.8020833333333334 | 56.398 |
| 0.8027777777777777 | 56.398 |
| 0.8034722222222223 | 56.398 |
| 0.8041666666666667 | 56.398 |
| 0.8048611111111111 | 56.398 |
| 0.8055555555555555 | 56.398 |
| 0.80625 | 51.951 |
| 0.8069444444444445 | 51.951 |
| 0.8076388888888889 | 51.951 |
| 0.8083333333333332 | 51.951 |
| 0.8090277777777778 | 51.951 |
| 0.8097222222222222 | 43.079 |
| 0.8104166666666667 | 43.079 |
| 0.811111111111111 | 38.653 |
| 0.8118055555555556 | 38.653 |
| 0.8125 | 38.653 |
| 0.8131944444444444 | 38.653 |
| 0.813888888888889 | 38.653 |
| 0.8145833333333333 | 38.653 |
| 0.8152777777777778 | 34.234 |
| 0.8159722222222222 | 34.234 |
| 0.8166666666666668 | 34.234 |
| 0.8173611111111111 | 34.234 |
| 0.8180555555555555 | 29.823 |
| 0.81875 | 29.823 |
| 0.8194444444444445 | 29.823 |
| 0.8201388888888889 | 29.823 |
| 0.8208333333333333 | 29.823 |
| 0.8215277777777777 | 29.823 |
| 0.8222222222222223 | 29.823 |
| 0.8229166666666666 | 29.823 |
| 0.8236111111111111 | 29.823 |
| 0.8243055555555556 | 29.823 |
| 0.8250000000000001 | 29.823 |
| 0.8256944444444444 | 29.823 |
| 0.8263888888888888 | 29.823 |
| 0.8270833333333334 | 29.823 |
| 0.8277777777777778 | 25.419 |
| 0.8284722222222222 | 25.419 |
| 0.8291666666666666 | 25.419 |
| 0.8298611111111112 | 25.419 |
| 0.8305555555555556 | 25.419 |
| 0.8312499999999999 | 25.419 |
| 0.8319444444444444 | 25.419 |
| 0.8326388888888889 | 25.419 |
| 0.8333333333333334 | 25.419 |
| 0.8340277777777777 | 25.419 |
| 0.8347222222222223 | 21.024 |
| 0.8354166666666667 | 21.024 |
| 0.8361111111111111 | 21.024 |
| 0.8368055555555555 | 21.024 |
| 0.8375 | 21.024 |
| 0.8381944444444445 | 16.636 |
| 0.8388888888888889 | 16.636 |
| 0.8395833333333332 | 16.636 |
| 0.8402777777777778 | 16.636 |
| 0.8409722222222222 | 16.636 |
| 0.8416666666666667 | 12.257 |
| 0.842361111111111 | 12.257 |
| 0.8430555555555556 | 12.257 |
| 0.84375 | 12.257 |
| 0.8444444444444444 | 12.257 |
| 0.845138888888889 | 12.257 |
| 0.8458333333333333 | 7.887 |
| 0.8465277777777778 | 7.887 |
| 0.8472222222222222 | 7.887 |
| 0.8479166666666668 | 7.887 |
| 0.8486111111111111 | 7.887 |
| 0.8493055555555555 | 7.887 |
| 0.85 | 3.525 |
| 0.8506944444444445 | 3.525 |
| 0.8513888888888889 | 3.525 |
| 0.8520833333333333 | 3.525 |
| 0.8527777777777777 | 3.525 |
| 0.8534722222222223 | 3.525 |
| 0.8541666666666666 | 3.525 |
| 0.8548611111111111 | 3.525 |
| 0.8555555555555556 | 0 |
| 0.8562500000000001 | 0 |
| 0.8569444444444444 | 0 |
| 0.8576388888888888 | 0 |
| 0.8583333333333334 | 0 |
| 0.8590277777777778 | 0 |
| 0.8597222222222222 | 0 |
| 0.8604166666666666 | 0 |
| 0.8611111111111112 | 0 |
| 0.8618055555555556 | 0 |
| 0.8624999999999999 | 0 |
| 0.8631944444444444 | 0 |
| 0.8638888888888889 | 0 |
| 0.8645833333333334 | 0 |
| 0.8652777777777777 | 0 |
| 0.8659722222222223 | 0 |
| 0.8666666666666667 | 0 |
| 0.8673611111111111 | 0 |
| 0.8680555555555555 | 0 |
| 0.86875 | 0 |
| 0.8694444444444445 | 0 |
| 0.8701388888888889 | 0 |
| 0.8708333333333332 | 0 |
| 0.8715277777777778 | 0 |
| 0.8722222222222222 | 0 |
| 0.8729166666666667 | 0 |
| 0.873611111111111 | 0 |
| 0.8743055555555556 | 0 |
| 0.875 | 0 |
| 0.8756944444444444 | 0 |
| 0.876388888888889 | 0 |
| 0.8770833333333333 | 0 |
| 0.8777777777777778 | 0 |
| 0.8784722222222222 | 0 |
| 0.8791666666666668 | 0 |
| 0.8798611111111111 | 0 |
| 0.8805555555555555 | 0 |
| 0.88125 | 0 |
| 0.8819444444444445 | 0 |
| 0.8826388888888889 | 0 |
| 0.8833333333333333 | 0 |
| 0.8840277777777777 | 0 |
| 0.8847222222222223 | 0 |
| 0.8854166666666666 | 0 |
| 0.8861111111111111 | 0 |
| 0.8868055555555556 | 0 |
| 0.8875000000000001 | 0 |
| 0.8881944444444444 | 0 |
| 0.8888888888888888 | 0 |
| 0.8895833333333334 | 0 |
| 0.8902777777777778 | 0 |
| 0.8909722222222222 | 0 |
| 0.8916666666666666 | 0 |
| 0.8923611111111112 | 0 |
| 0.8930555555555556 | 0 |
| 0.8937499999999999 | 0 |
| 0.8944444444444444 | 0 |
| 0.8951388888888889 | 0 |
| 0.8958333333333334 | 0 |
| 0.8965277777777777 | 0 |
| 0.8972222222222223 | 0 |
| 0.8979166666666667 | 0 |
| 0.8986111111111111 | 0 |
| 0.8993055555555555 | 0 |
| 0.9 | 0 |
| 0.9006944444444445 | 0 |
| 0.9013888888888889 | 0 |
| 0.9020833333333332 | 0 |
| 0.9027777777777778 | 0 |
| 0.9034722222222222 | 0 |
| 0.9041666666666667 | 0 |
| 0.904861111111111 | 0 |
| 0.9055555555555556 | 0 |
| 0.90625 | 0 |
| 0.9069444444444444 | 0 |
| 0.907638888888889 | 0 |
| 0.9083333333333333 | 0 |
| 0.9090277777777778 | 0 |
| 0.9097222222222222 | 0 |
| 0.9104166666666668 | 0 |
| 0.9111111111111111 | 0 |
| 0.9118055555555555 | 0 |
| 0.9125 | 0 |
| 0.9131944444444445 | 0 |
| 0.9138888888888889 | 0 |
| 0.9145833333333333 | 0 |
| 0.9152777777777777 | 0 |
| 0.9159722222222223 | 0 |
| 0.9166666666666666 | 0 |
| 0.9173611111111111 | 0 |
| 0.9180555555555556 | 0 |
| 0.9187500000000001 | 0 |
| 0.9194444444444444 | 0 |
| 0.9201388888888888 | 0 |
| 0.9208333333333334 | 0 |
| 0.9215277777777778 | 0 |
| 0.9222222222222222 | 0 |
| 0.9229166666666666 | 0 |
| 0.9236111111111112 | 0 |
| 0.9243055555555556 | 0 |
| 0.9249999999999999 | 0 |
| 0.9256944444444444 | 0 |
| 0.9263888888888889 | 0 |
| 0.9270833333333334 | 0 |
| 0.9277777777777777 | 0 |
| 0.9284722222222223 | 0 |
| 0.9291666666666667 | 0 |
| 0.9298611111111111 | 0 |
| 0.9305555555555555 | 0 |
| 0.93125 | 0 |
| 0.9319444444444445 | 0 |
| 0.9326388888888889 | 0 |
| 0.9333333333333332 | 0 |
| 0.9340277777777778 | 0 |
| 0.9347222222222222 | 0 |
| 0.9354166666666667 | 0 |
| 0.936111111111111 | 0 |
| 0.9368055555555556 | 0 |
| 0.9375 | 0 |
| 0.9381944444444444 | 0 |
| 0.938888888888889 | 0 |
| 0.9395833333333333 | 0 |
| 0.9402777777777778 | 0 |
| 0.9409722222222222 | 0 |
| 0.9416666666666668 | 0 |
| 0.9423611111111111 | 0 |
| 0.9430555555555555 | 0 |
| 0.94375 | 0 |
| 0.9444444444444445 | 0 |
| 0.9451388888888889 | 0 |
| 0.9458333333333333 | 0 |
| 0.9465277777777777 | 0 |
| 0.9472222222222223 | 0 |
| 0.9479166666666666 | 0 |
| 0.9486111111111111 | 0 |
| 0.9493055555555556 | 0 |
| 0.9500000000000001 | 0 |
| 0.9506944444444444 | 0 |
| 0.9513888888888888 | 0 |
| 0.9520833333333334 | 0 |
| 0.9527777777777778 | 0 |
| 0.9534722222222222 | 0 |
| 0.9541666666666666 | 0 |
| 0.9548611111111112 | 0 |
| 0.9555555555555556 | 0 |
| 0.9562499999999999 | 0 |
| 0.9569444444444444 | 0 |
| 0.9576388888888889 | 0 |
| 0.9583333333333334 | 0 |
| 0.9590277777777777 | 0 |
| 0.9597222222222223 | 0 |
| 0.9604166666666667 | 0 |
| 0.9611111111111111 | 0 |
| 0.9618055555555555 | 0 |
| 0.9625 | 0 |
| 0.9631944444444445 | 0 |
| 0.9638888888888889 | 0 |
| 0.9645833333333332 | 0 |
| 0.9652777777777778 | 0 |
| 0.9659722222222222 | 0 |
| 0.9666666666666667 | 0 |
| 0.967361111111111 | 0 |
| 0.9680555555555556 | 0 |
| 0.96875 | 0 |
| 0.9694444444444444 | 0 |
| 0.970138888888889 | 0 |
| 0.9708333333333333 | 0 |
| 0.9715277777777778 | 0 |
| 0.9722222222222222 | 0 |
| 0.9729166666666668 | 0 |
| 0.9736111111111111 | 0 |
| 0.9743055555555555 | 0 |
| 0.975 | 0 |
| 0.9756944444444445 | 0 |
| 0.9763888888888889 | 0 |
| 0.9770833333333333 | 0 |
| 0.9777777777777777 | 0 |
| 0.9784722222222223 | 0 |
| 0.9791666666666666 | 0 |
| 0.9798611111111111 | 0 |
| 0.9805555555555556 | 0 |
| 0.9812500000000001 | 0 |
| 0.9819444444444444 | 0 |
| 0.9826388888888888 | 0 |
| 0.9833333333333334 | 0 |
| 0.9840277777777778 | 0 |
| 0.9847222222222222 | 0 |
| 0.9854166666666666 | 0 |
| 0.9861111111111112 | 0 |
| 0.9868055555555556 | 0 |
| 0.9874999999999999 | 0 |
| 0.9881944444444444 | 0 |
| 0.9888888888888889 | 0 |
| 0.9895833333333334 | 0 |
| 0.9902777777777777 | 0 |
| 0.9909722222222223 | 0 |
| 0.9916666666666667 | 0 |
| 0.9923611111111111 | 0 |
| 0.9930555555555555 | 0 |
| 0.99375 | 0 |
| 0.9944444444444445 | 0 |
| 0.9951388888888889 | 0 |
| 0.9958333333333332 | 0 |
| 0.9965277777777778 | 0 |
| 0.9972222222222222 | 0 |
| 0.9979166666666667 | 0 |
| 0.998611111111111 | 0 |
| 0.9993055555555556 | 0 |